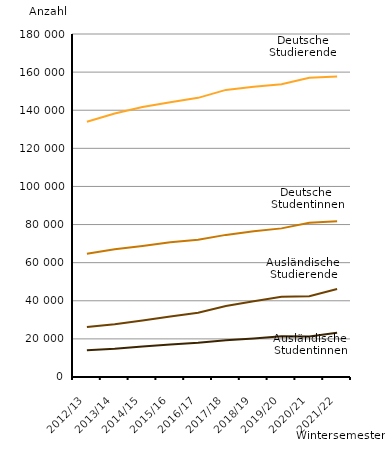
| Category |  Deutsche 
Studierende | Deutsche 
Studentinnen | Ausländische 
Studierende | Ausländische 
Studentinnen |
|---|---|---|---|---|
| 2012/13 | 133987 | 64635 | 26233 | 14067 |
| 2013/14 | 138273 | 67000 | 27650 | 14785 |
| 2014/15 | 141638 | 68805 | 29625 | 15943 |
| 2015/16 | 144192 | 70696 | 31725 | 17073 |
| 2016/17 | 146492 | 72049 | 33743 | 17916 |
| 2017/18 | 150660 | 74577 | 37274 | 19292 |
| 2018/19 | 152364 | 76433 | 39765 | 20179 |
| 2019/20 | 153644 | 77995 | 42155 | 21338 |
| 2020/21 | 157007 | 80972 | 42414 | 21251 |
| 2021/22 | 157725 | 81786 | 46144 | 23215 |